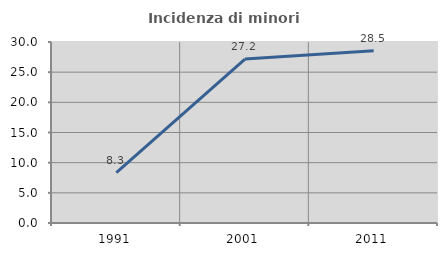
| Category | Incidenza di minori stranieri |
|---|---|
| 1991.0 | 8.333 |
| 2001.0 | 27.17 |
| 2011.0 | 28.531 |